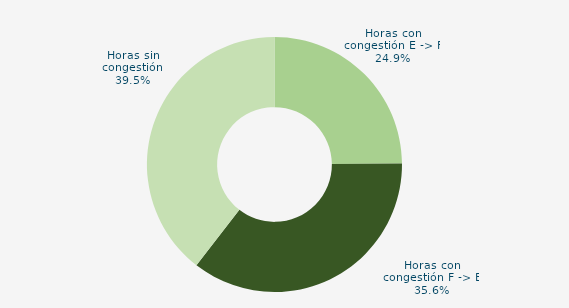
| Category | Horas con congestión E -> F |
|---|---|
| Horas con congestión E -> F | 24.866 |
| Horas con congestión F -> E | 35.618 |
| Horas sin congestión | 39.516 |